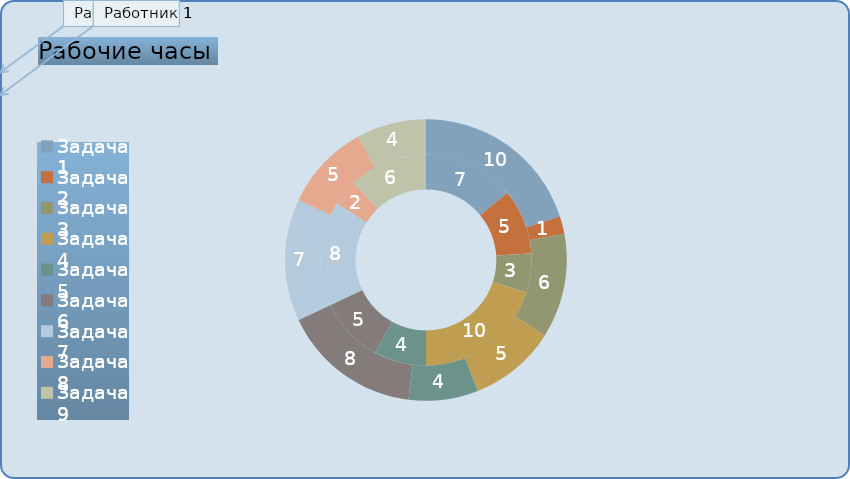
| Category | Работник 1 (ч.) | Работник 2 (ч.) |
|---|---|---|
| Задача 1 | 7 | 10 |
| Задача 2 | 5 | 1 |
| Задача 3 | 3 | 6 |
| Задача 4 | 10 | 5 |
| Задача 5 | 4 | 4 |
| Задача 6 | 5 | 8 |
| Задача 7 | 8 | 7 |
| Задача 8 | 2 | 5 |
| Задача 9 | 6 | 4 |